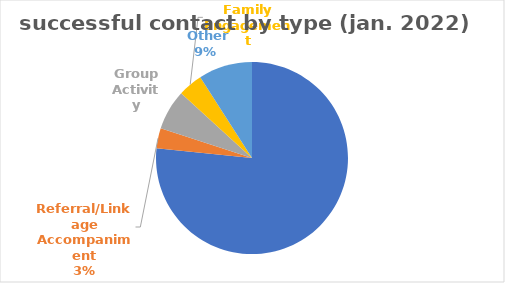
| Category | Series 0 |
|---|---|
| Individual Meeting | 203 |
| Referral/Linkage Accompaniment | 9 |
| Group Activity | 18 |
| Family Engagement | 11 |
|  Other | 24 |